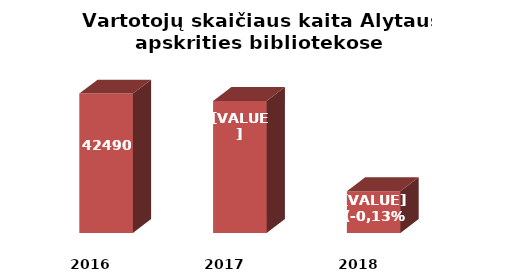
| Category | Series 0 |
|---|---|
| 2016.0 | 42490 |
| 2017.0 | 42433 |
| 2018.0 | 41727 |